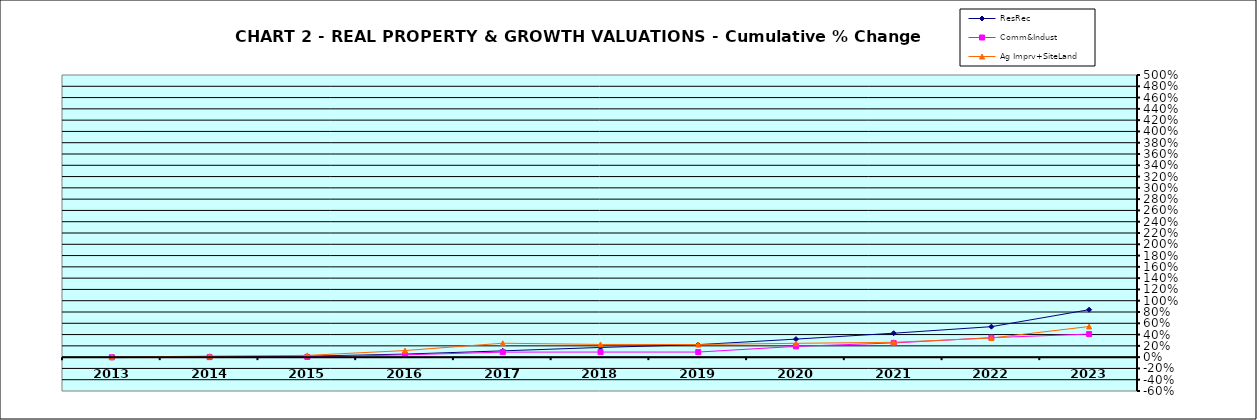
| Category | ResRec | Comm&Indust | Ag Imprv+SiteLand |
|---|---|---|---|
| 2013.0 | -0.009 | -0.001 | 0 |
| 2014.0 | 0.004 | 0 | 0.019 |
| 2015.0 | 0.017 | 0.004 | 0.031 |
| 2016.0 | 0.054 | 0.041 | 0.117 |
| 2017.0 | 0.111 | 0.089 | 0.247 |
| 2018.0 | 0.172 | 0.09 | 0.225 |
| 2019.0 | 0.222 | 0.09 | 0.224 |
| 2020.0 | 0.319 | 0.191 | 0.245 |
| 2021.0 | 0.424 | 0.251 | 0.263 |
| 2022.0 | 0.54 | 0.346 | 0.339 |
| 2023.0 | 0.841 | 0.408 | 0.543 |